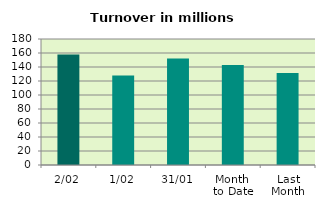
| Category | Series 0 |
|---|---|
| 2/02 | 157.734 |
| 1/02 | 127.756 |
| 31/01 | 151.993 |
| Month 
to Date | 142.745 |
| Last
Month | 131.402 |